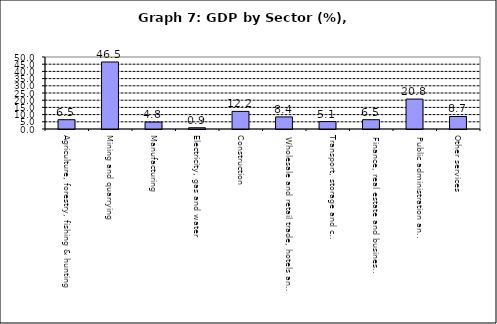
| Category | Series 0 |
|---|---|
| Agriculture, forestry, fishing & hunting | 6.456 |
| Mining and quarrying  | 46.534 |
| Manufacturing | 4.789 |
| Electricity, gas and water | 0.879 |
| Construction | 12.219 |
| Wholesale and retail trade, hotels and restaurants  | 8.406 |
| Transport, storage and communication                | 5.148 |
| Finance, real estate and business services          | 6.461 |
| Public administration and Defense                       | 20.773 |
| Other services                                    | 8.683 |